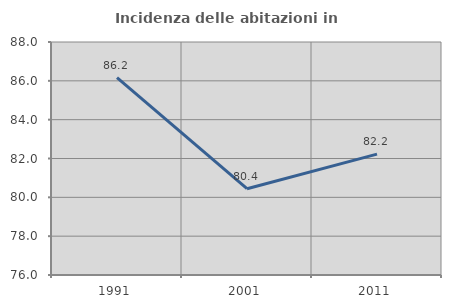
| Category | Incidenza delle abitazioni in proprietà  |
|---|---|
| 1991.0 | 86.162 |
| 2001.0 | 80.444 |
| 2011.0 | 82.227 |